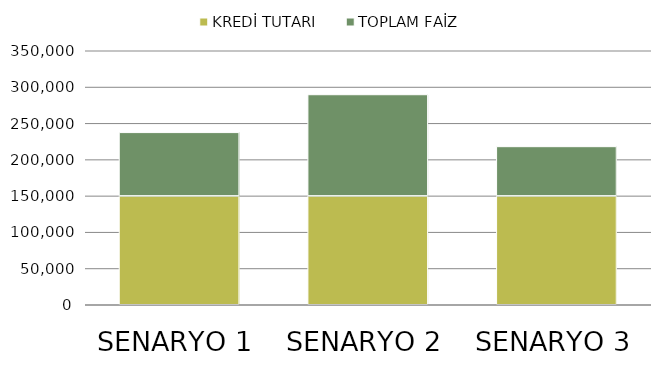
| Category | KREDİ TUTARI | TOPLAM FAİZ |
|---|---|---|
| SENARYO 1 | 150000 | 87584.066 |
| SENARYO 2 | 150000 | 139753.762 |
| SENARYO 3 | 150000 | 68152.919 |